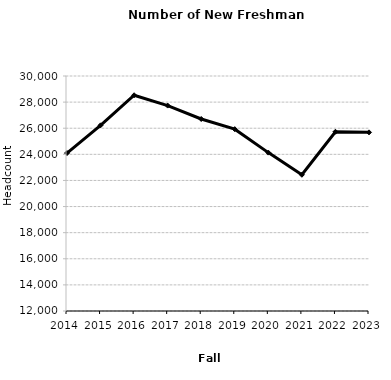
| Category | Applicants |
|---|---|
| 2014.0 | 24097 |
| 2015.0 | 26222 |
| 2016.0 | 28525 |
| 2017.0 | 27734 |
| 2018.0 | 26706 |
| 2019.0 | 25928 |
| 2020.0 | 24132 |
| 2021.0 | 22434 |
| 2022.0 | 25729 |
| 2023.0 | 25682 |